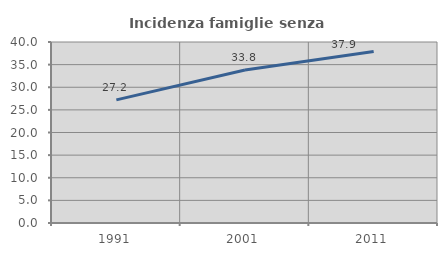
| Category | Incidenza famiglie senza nuclei |
|---|---|
| 1991.0 | 27.217 |
| 2001.0 | 33.806 |
| 2011.0 | 37.888 |